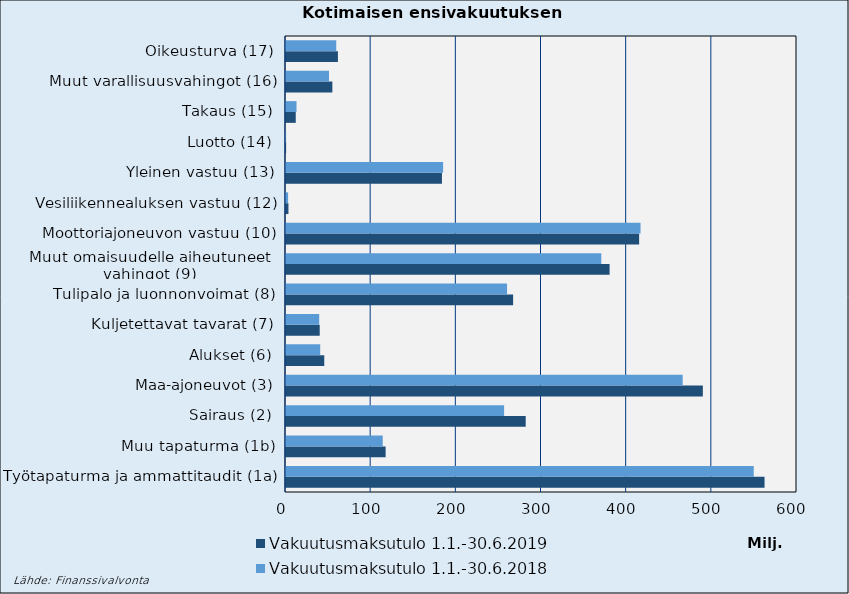
| Category | Vakuutusmaksutulo |
|---|---|
| Työtapaturma ja ammattitaudit (1a) | 549203.912 |
| Muu tapaturma (1b) | 113559.162 |
| Sairaus (2) | 256082.763 |
| Maa-ajoneuvot (3) | 465785.923 |
| Alukset (6) | 40167.904 |
| Kuljetettavat tavarat (7) | 38987.667 |
| Tulipalo ja luonnonvoimat (8) | 259536.578 |
| Muut omaisuudelle aiheutuneet 
vahingot (9) | 370203.097 |
| Moottoriajoneuvon vastuu (10) | 416293.365 |
| Vesiliikennealuksen vastuu (12) | 2468.44 |
| Yleinen vastuu (13) | 184474.955 |
| Luotto (14) | 140.949 |
| Takaus (15) | 12339.334 |
| Muut varallisuusvahingot (16) | 50491.37 |
| Oikeusturva (17) | 59005.338 |